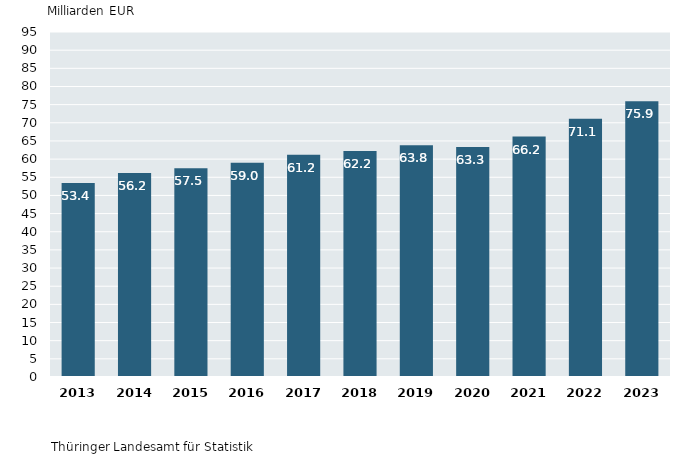
| Category | 1. Bruttoinlandsprodukt in jeweiligen Preisen in Thüringen 2013 bis 2023 |
|---|---|
| 2013.0 | 53.4 |
| 2014.0 | 56.2 |
| 2015.0 | 57.5 |
| 2016.0 | 59 |
| 2017.0 | 61.2 |
| 2018.0 | 62.2 |
| 2019.0 | 63.8 |
| 2020.0 | 63.3 |
| 2021.0 | 66.2 |
| 2022.0 | 71.1 |
| 2023.0 | 75.9 |